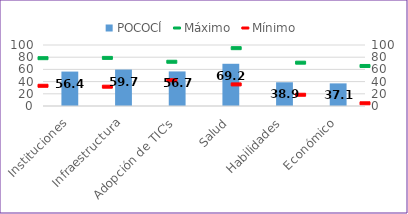
| Category | POCOCÍ |
|---|---|
| Instituciones | 56.435 |
| Infraestructura | 59.747 |
| Adopción de TIC's | 56.664 |
| Salud | 69.212 |
| Habilidades | 38.864 |
| Económico | 37.079 |